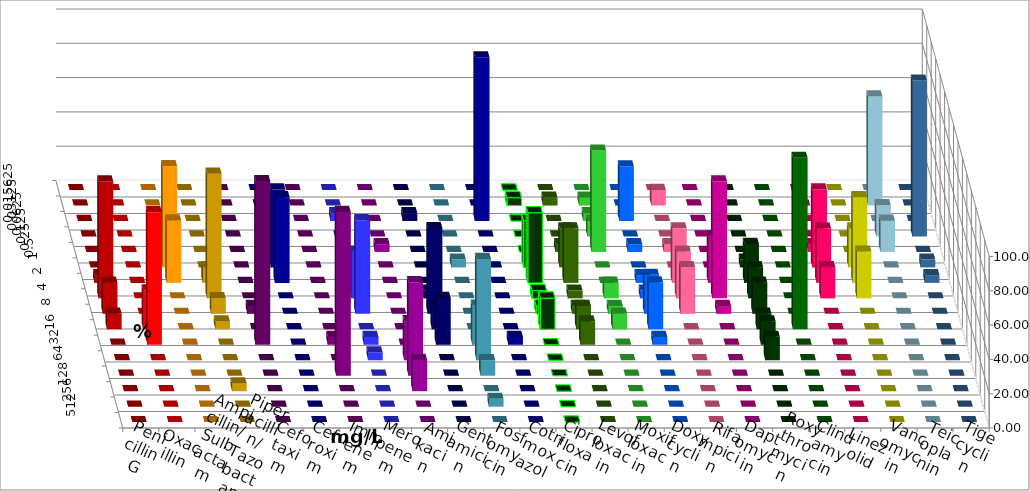
| Category | Penicillin G | Oxacillin | Ampicillin/ Sulbactam | Piperacillin/ Tazobactam | Cefotaxim | Cefuroxim | Imipenem | Meropenem | Amikacin | Gentamicin | Fosfomycin | Cotrimoxazol | Ciprofloxacin | Levofloxacin | Moxifloxacin | Doxycyclin | Rifampicin | Daptomycin | Roxythromycin | Clindamycin | Linezolid | Vancomycin | Teicoplanin | Tigecyclin |
|---|---|---|---|---|---|---|---|---|---|---|---|---|---|---|---|---|---|---|---|---|---|---|---|---|
| 0.015625 | 0 | 0 | 0 | 0 | 0 | 0 | 0 | 0 | 0 | 0 | 0 | 0 | 0 | 0 | 0 | 0 | 0 | 0 | 0 | 0 | 0 | 0 | 0 | 0 |
| 0.03125 | 0 | 0 | 0 | 0 | 0 | 0 | 0 | 0 | 0 | 0 | 0 | 0 | 4.545 | 4.545 | 4.545 | 0 | 9.091 | 0 | 0 | 0 | 0 | 0 | 0 | 63.636 |
| 0.0625 | 0 | 0 | 0 | 0 | 0 | 0 | 4.545 | 4.545 | 0 | 4.545 | 0 | 95.455 | 0 | 0 | 4.545 | 31.818 | 0 | 0 | 0 | 0 | 0 | 0 | 0 | 0 |
| 0.125 | 0 | 0 | 4.545 | 0 | 0 | 0 | 0 | 0 | 0 | 0 | 0 | 0 | 0 | 0 | 9.091 | 0 | 0 | 0 | 0 | 0 | 0 | 0 | 90.909 | 18.182 |
| 0.25 | 0 | 0 | 0 | 0 | 0 | 0 | 0 | 0 | 4.545 | 0 | 0 | 0 | 0 | 4.545 | 59.091 | 4.545 | 4.545 | 0 | 0 | 0 | 4.545 | 0 | 0 | 18.182 |
| 0.5 | 0 | 0 | 59.091 | 0 | 0 | 0 | 45.455 | 0 | 0 | 0 | 4.545 | 0 | 27.273 | 22.727 | 0 | 0 | 0 | 0 | 4.545 | 0 | 45.455 | 22.727 | 4.545 | 0 |
| 1.0 | 4.545 | 0 | 36.364 | 9.091 | 0 | 0 | 50 | 4.545 | 0 | 0 | 0 | 0 | 40.909 | 31.818 | 0 | 4.545 | 31.818 | 27.273 | 22.727 | 0 | 31.818 | 50 | 4.545 | 0 |
| 2.0 | 68.182 | 0 | 0 | 72.727 | 0 | 0 | 0 | 27.273 | 0 | 4.545 | 0 | 0 | 4.545 | 4.545 | 9.091 | 4.545 | 27.273 | 68.182 | 18.182 | 0 | 18.182 | 27.273 | 0 | 0 |
| 4.0 | 18.182 | 0 | 0 | 9.091 | 4.545 | 0 | 0 | 54.545 | 0 | 50 | 0 | 0 | 4.545 | 4.545 | 4.545 | 22.727 | 27.273 | 4.545 | 18.182 | 0 | 0 | 0 | 0 | 0 |
| 8.0 | 9.091 | 22.727 | 0 | 4.545 | 0 | 0 | 0 | 0 | 0 | 13.636 | 0 | 0 | 18.182 | 13.636 | 9.091 | 27.273 | 0 | 0 | 9.091 | 100 | 0 | 0 | 0 | 0 |
| 16.0 | 0 | 77.273 | 0 | 0 | 95.455 | 4.545 | 0 | 4.545 | 0 | 27.273 | 22.727 | 4.545 | 0 | 13.636 | 0 | 4.545 | 0 | 0 | 13.636 | 0 | 0 | 0 | 0 | 0 |
| 32.0 | 0 | 0 | 0 | 0 | 0 | 0 | 0 | 4.545 | 22.727 | 0 | 59.091 | 0 | 0 | 0 | 0 | 0 | 0 | 0 | 13.636 | 0 | 0 | 0 | 0 | 0 |
| 64.0 | 0 | 0 | 0 | 0 | 0 | 95.455 | 0 | 0 | 54.545 | 0 | 9.091 | 0 | 0 | 0 | 0 | 0 | 0 | 0 | 0 | 0 | 0 | 0 | 0 | 0 |
| 128.0 | 0 | 0 | 0 | 4.545 | 0 | 0 | 0 | 0 | 18.182 | 0 | 0 | 0 | 0 | 0 | 0 | 0 | 0 | 0 | 0 | 0 | 0 | 0 | 0 | 0 |
| 256.0 | 0 | 0 | 0 | 0 | 0 | 0 | 0 | 0 | 0 | 0 | 4.545 | 0 | 0 | 0 | 0 | 0 | 0 | 0 | 0 | 0 | 0 | 0 | 0 | 0 |
| 512.0 | 0 | 0 | 0 | 0 | 0 | 0 | 0 | 0 | 0 | 0 | 0 | 0 | 0 | 0 | 0 | 0 | 0 | 0 | 0 | 0 | 0 | 0 | 0 | 0 |